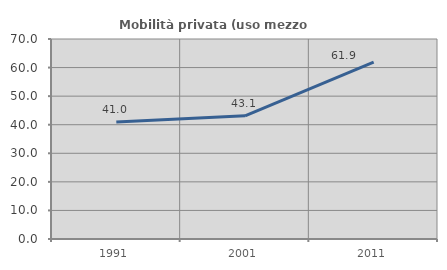
| Category | Mobilità privata (uso mezzo privato) |
|---|---|
| 1991.0 | 40.957 |
| 2001.0 | 43.114 |
| 2011.0 | 61.875 |